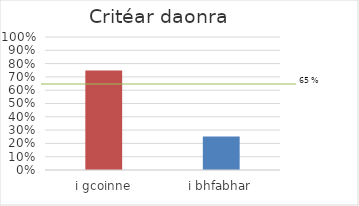
| Category | Daonra |
|---|---|
| i gcoinne | 0.749 |
| i bhfabhar | 0.251 |